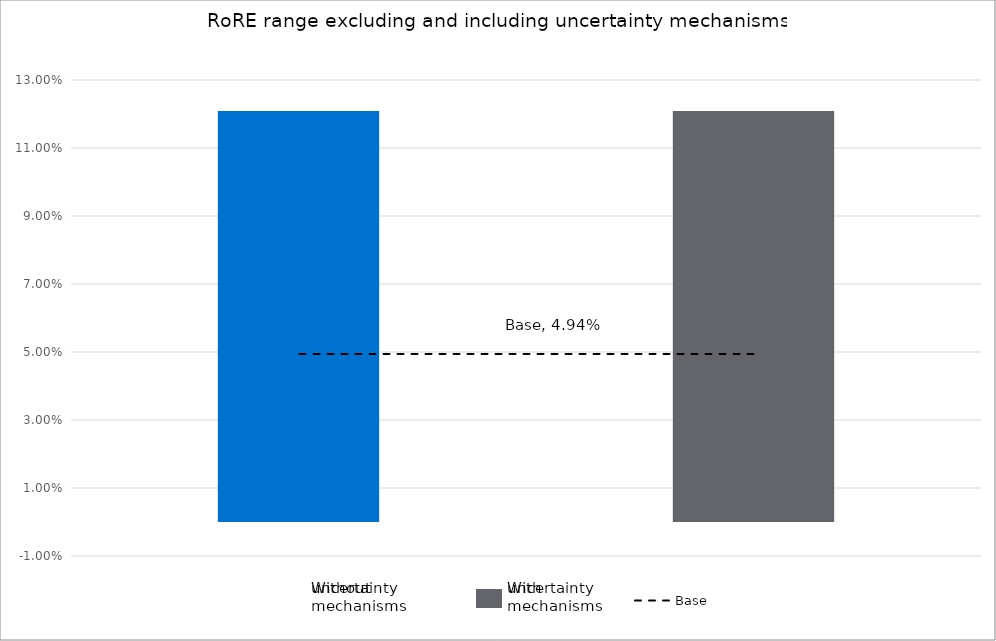
| Category | Low case | High case |
|---|---|---|
| Without uncertainty | -0.013 | 0.121 |
| Without uncertainty | -0.013 | 0.121 |